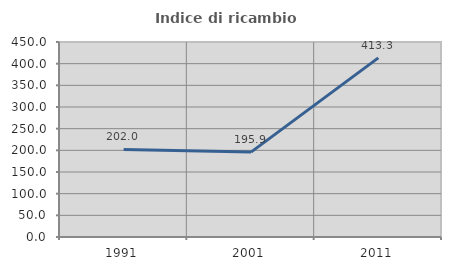
| Category | Indice di ricambio occupazionale  |
|---|---|
| 1991.0 | 201.961 |
| 2001.0 | 195.918 |
| 2011.0 | 413.333 |